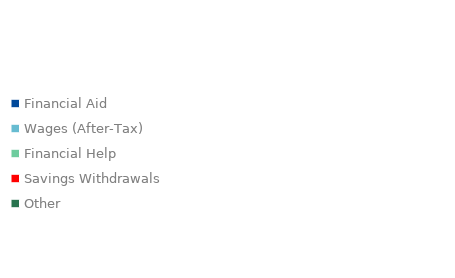
| Category | Series 0 |
|---|---|
| Financial Aid | 0 |
| Wages (After-Tax) | 0 |
| Financial Help | 0 |
| Savings Withdrawals | 0 |
| Other | 0 |